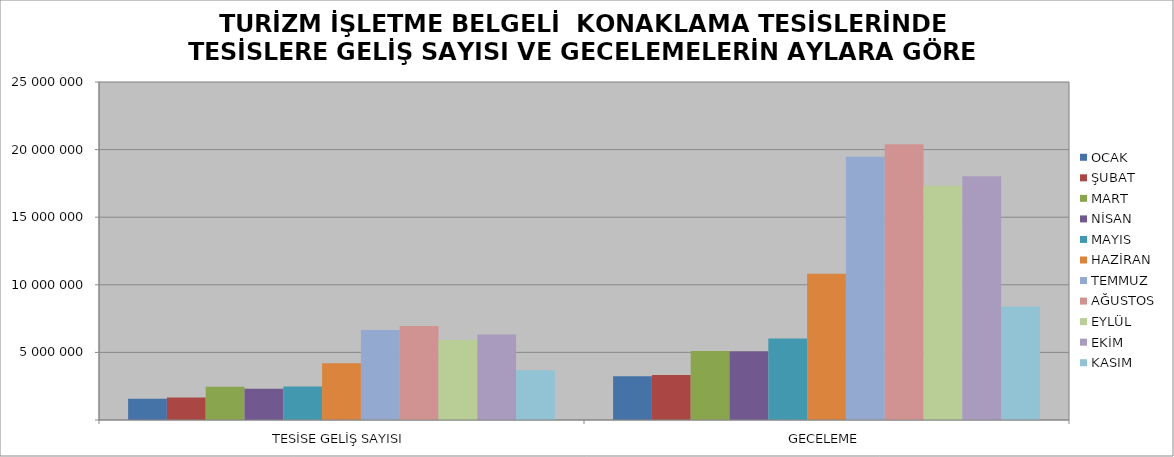
| Category | OCAK | ŞUBAT | MART | NİSAN | MAYIS | HAZİRAN | TEMMUZ | AĞUSTOS | EYLÜL | EKİM | KASIM |
|---|---|---|---|---|---|---|---|---|---|---|---|
| TESİSE GELİŞ SAYISI | 1571594 | 1670164 | 2462715 | 2305703 | 2480312 | 4203299 | 6647723 | 6953153 | 5925169 | 6333100 | 3670952 |
| GECELEME | 3239980 | 3333484 | 5094921 | 5081446 | 6019981 | 10819754 | 19475865 | 20388962 | 17330893 | 18033301 | 8403355 |